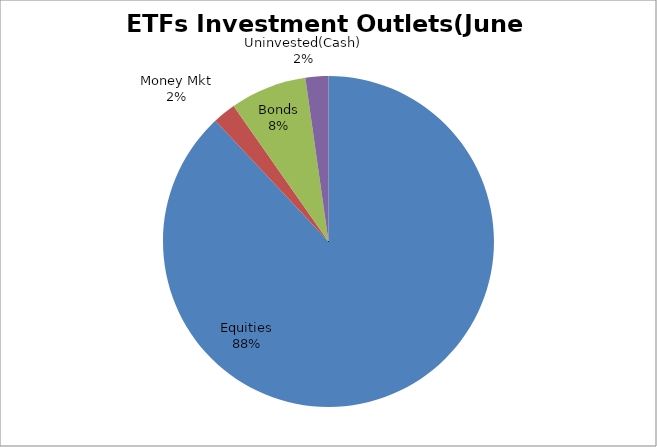
| Category | Series 0 |
|---|---|
| Equities | 5688266618.66 |
| Money Mkt | 146073161.64 |
| Bonds | 483544793.6 |
| Uninvested(Cash) | 144539302.66 |